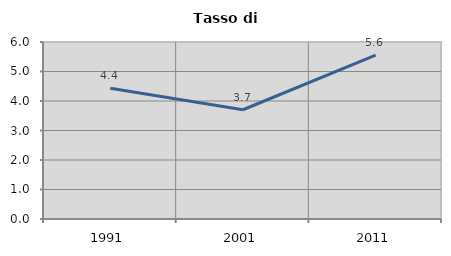
| Category | Tasso di disoccupazione   |
|---|---|
| 1991.0 | 4.432 |
| 2001.0 | 3.704 |
| 2011.0 | 5.551 |